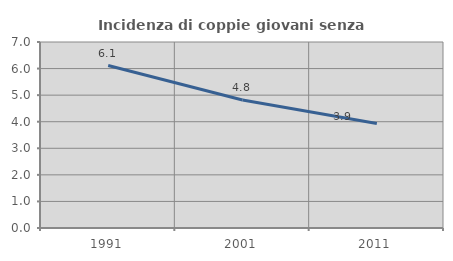
| Category | Incidenza di coppie giovani senza figli |
|---|---|
| 1991.0 | 6.114 |
| 2001.0 | 4.819 |
| 2011.0 | 3.93 |